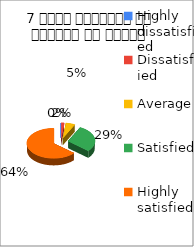
| Category | 7 विषय अवधारणा पर शिक्षक का ज्ञान  |
|---|---|
| Highly dissatisfied | 0 |
| Dissatisfied | 1 |
| Average | 3 |
| Satisfied | 16 |
| Highly satisfied | 35 |